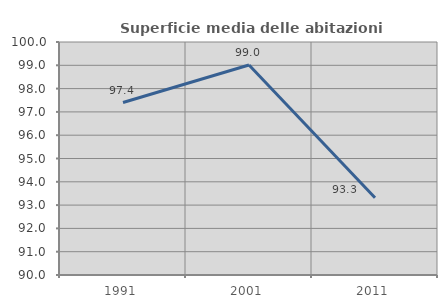
| Category | Superficie media delle abitazioni occupate |
|---|---|
| 1991.0 | 97.401 |
| 2001.0 | 99.012 |
| 2011.0 | 93.315 |